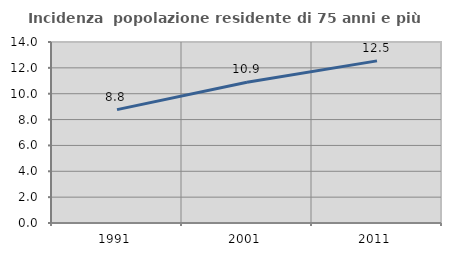
| Category | Incidenza  popolazione residente di 75 anni e più |
|---|---|
| 1991.0 | 8.767 |
| 2001.0 | 10.88 |
| 2011.0 | 12.54 |